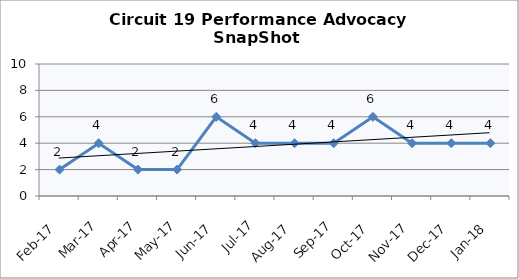
| Category | Circuit 19 |
|---|---|
| Feb-17 | 2 |
| Mar-17 | 4 |
| Apr-17 | 2 |
| May-17 | 2 |
| Jun-17 | 6 |
| Jul-17 | 4 |
| Aug-17 | 4 |
| Sep-17 | 4 |
| Oct-17 | 6 |
| Nov-17 | 4 |
| Dec-17 | 4 |
| Jan-18 | 4 |